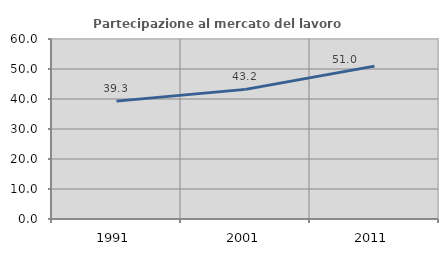
| Category | Partecipazione al mercato del lavoro  femminile |
|---|---|
| 1991.0 | 39.291 |
| 2001.0 | 43.208 |
| 2011.0 | 50.958 |